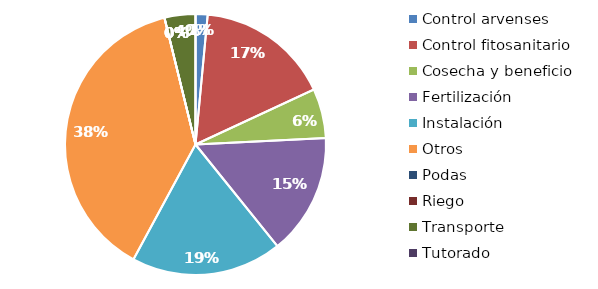
| Category | Valor |
|---|---|
| Control arvenses | 268323 |
| Control fitosanitario | 2981072 |
| Cosecha y beneficio | 1101242.751 |
| Fertilización | 2696400 |
| Instalación | 3356535 |
| Otros | 6882765 |
| Podas | 0 |
| Riego | 0 |
| Transporte | 688277 |
| Tutorado | 0 |